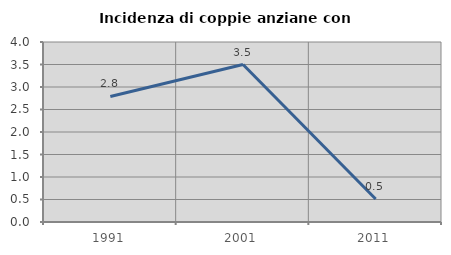
| Category | Incidenza di coppie anziane con figli |
|---|---|
| 1991.0 | 2.791 |
| 2001.0 | 3.5 |
| 2011.0 | 0.51 |